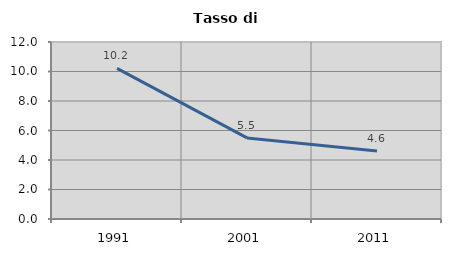
| Category | Tasso di disoccupazione   |
|---|---|
| 1991.0 | 10.208 |
| 2001.0 | 5.497 |
| 2011.0 | 4.609 |